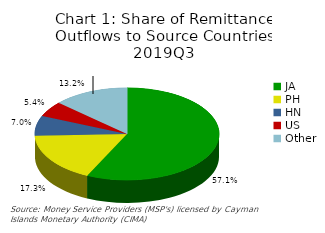
| Category | Chart 1: Share of Remittance Outflows to Source Countries 2019Q3 |
|---|---|
| JA | 0.571 |
| PH | 0.173 |
| HN | 0.07 |
| US | 0.054 |
| Other | 0.132 |